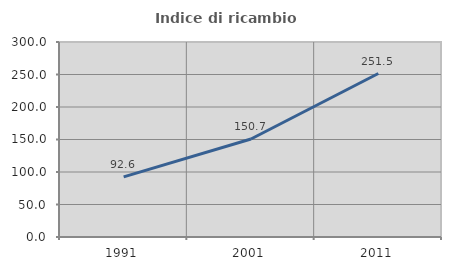
| Category | Indice di ricambio occupazionale  |
|---|---|
| 1991.0 | 92.582 |
| 2001.0 | 150.719 |
| 2011.0 | 251.531 |